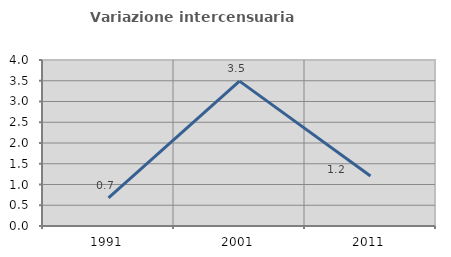
| Category | Variazione intercensuaria annua |
|---|---|
| 1991.0 | 0.676 |
| 2001.0 | 3.49 |
| 2011.0 | 1.203 |